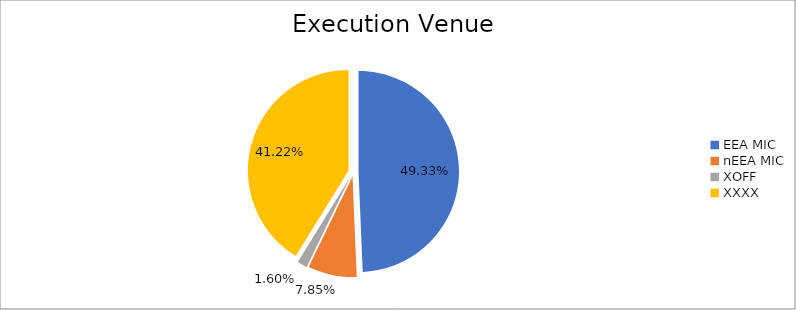
| Category | Series 0 |
|---|---|
| EEA MIC | 5507448.372 |
| nEEA MIC | 876772.257 |
| XOFF | 178490.391 |
| XXXX | 4601744.857 |